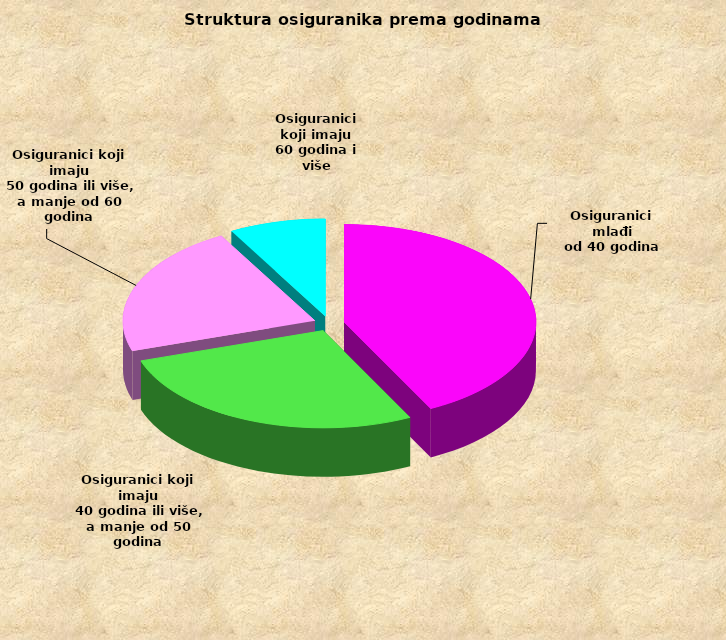
| Category | Series 0 |
|---|---|
| Osiguranici mlađi
od 40 godina | 701244 |
| Osiguranici koji imaju
 40 godina ili više, a manje od 50 godina | 452234 |
| Osiguranici koji imaju
 50 godina ili više, a manje od 60 godina | 361536 |
| Osiguranici koji imaju
60 godina i više | 133863 |